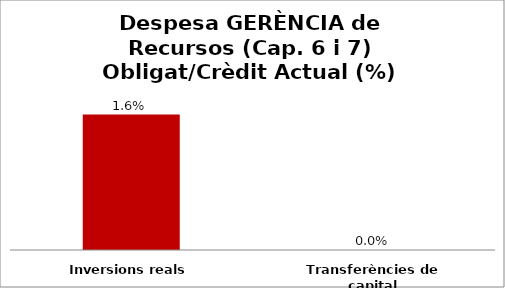
| Category | Series 0 |
|---|---|
| Inversions reals | 0.016 |
| Transferències de capital | 0 |